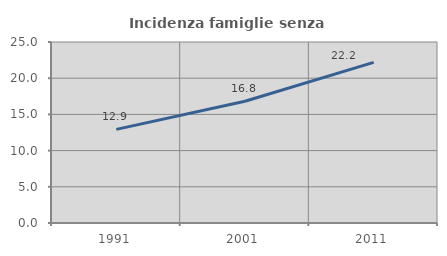
| Category | Incidenza famiglie senza nuclei |
|---|---|
| 1991.0 | 12.936 |
| 2001.0 | 16.816 |
| 2011.0 | 22.186 |